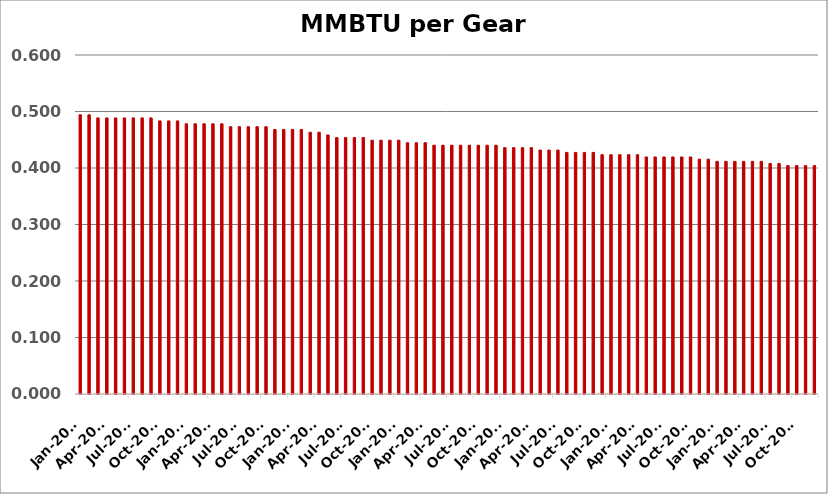
| Category | Series 0 |
|---|---|
| 2015-01-01 | 0.494 |
| 2015-02-01 | 0.494 |
| 2015-03-01 | 0.489 |
| 2015-04-01 | 0.489 |
| 2015-05-01 | 0.489 |
| 2015-06-01 | 0.489 |
| 2015-07-01 | 0.489 |
| 2015-08-01 | 0.489 |
| 2015-09-01 | 0.489 |
| 2015-10-01 | 0.483 |
| 2015-11-01 | 0.483 |
| 2015-12-01 | 0.483 |
| 2016-01-01 | 0.478 |
| 2016-02-01 | 0.478 |
| 2016-03-01 | 0.478 |
| 2016-04-01 | 0.478 |
| 2016-05-01 | 0.478 |
| 2016-06-01 | 0.473 |
| 2016-07-01 | 0.473 |
| 2016-08-01 | 0.473 |
| 2016-09-01 | 0.473 |
| 2016-10-01 | 0.473 |
| 2016-11-01 | 0.468 |
| 2016-12-01 | 0.468 |
| 2017-01-01 | 0.468 |
| 2017-02-01 | 0.468 |
| 2017-03-01 | 0.463 |
| 2017-04-01 | 0.463 |
| 2017-05-01 | 0.458 |
| 2017-06-01 | 0.454 |
| 2017-07-01 | 0.454 |
| 2017-08-01 | 0.454 |
| 2017-09-01 | 0.454 |
| 2017-10-01 | 0.449 |
| 2017-11-01 | 0.449 |
| 2017-12-01 | 0.449 |
| 2018-01-01 | 0.449 |
| 2018-02-01 | 0.445 |
| 2018-03-01 | 0.445 |
| 2018-04-01 | 0.445 |
| 2018-05-01 | 0.44 |
| 2018-06-01 | 0.44 |
| 2018-07-01 | 0.44 |
| 2018-08-01 | 0.44 |
| 2018-09-01 | 0.44 |
| 2018-10-01 | 0.44 |
| 2018-11-01 | 0.44 |
| 2018-12-01 | 0.44 |
| 2019-01-01 | 0.436 |
| 2019-02-01 | 0.436 |
| 2019-03-01 | 0.436 |
| 2019-04-01 | 0.436 |
| 2019-05-01 | 0.432 |
| 2019-06-01 | 0.432 |
| 2019-07-01 | 0.432 |
| 2019-08-01 | 0.428 |
| 2019-09-01 | 0.428 |
| 2019-10-01 | 0.428 |
| 2019-11-01 | 0.428 |
| 2019-12-01 | 0.424 |
| 2020-01-01 | 0.424 |
| 2020-02-01 | 0.424 |
| 2020-03-01 | 0.424 |
| 2020-04-01 | 0.424 |
| 2020-05-01 | 0.42 |
| 2020-06-01 | 0.42 |
| 2020-07-01 | 0.42 |
| 2020-08-01 | 0.42 |
| 2020-09-01 | 0.42 |
| 2020-10-01 | 0.42 |
| 2020-11-01 | 0.416 |
| 2020-12-01 | 0.416 |
| 2021-01-01 | 0.412 |
| 2021-02-01 | 0.412 |
| 2021-03-01 | 0.412 |
| 2021-04-01 | 0.412 |
| 2021-05-01 | 0.412 |
| 2021-06-01 | 0.412 |
| 2021-07-01 | 0.408 |
| 2021-08-01 | 0.408 |
| 2021-09-01 | 0.404 |
| 2021-10-01 | 0.404 |
| 2021-11-01 | 0.404 |
| 2021-12-01 | 0.404 |